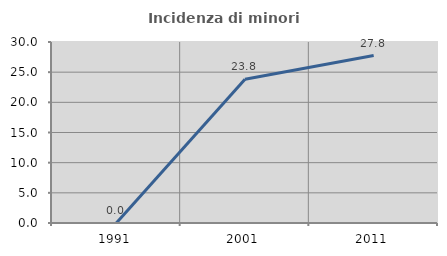
| Category | Incidenza di minori stranieri |
|---|---|
| 1991.0 | 0 |
| 2001.0 | 23.81 |
| 2011.0 | 27.75 |